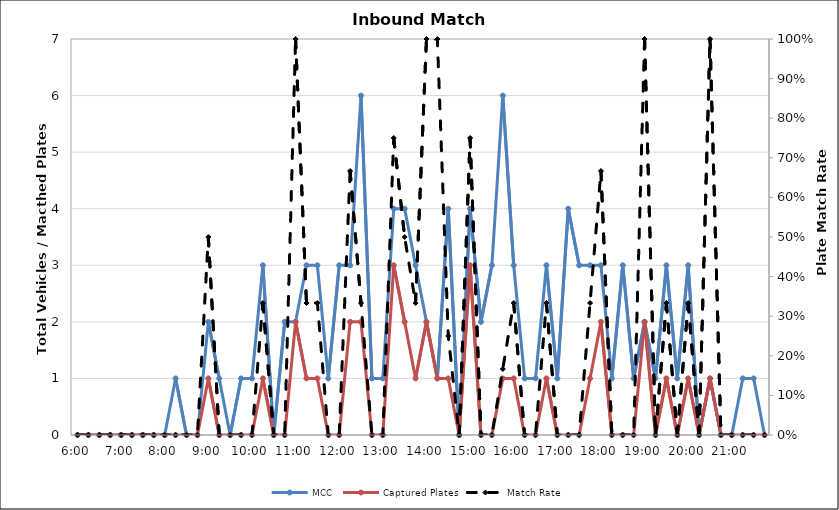
| Category | MCC | Captured Plates |
|---|---|---|
| 0.25 | 0 | 0 |
| 0.260416666666667 | 0 | 0 |
| 0.270833333333333 | 0 | 0 |
| 0.28125 | 0 | 0 |
| 0.291666666666667 | 0 | 0 |
| 0.302083333333333 | 0 | 0 |
| 0.3125 | 0 | 0 |
| 0.322916666666667 | 0 | 0 |
| 0.333333333333333 | 0 | 0 |
| 0.34375 | 1 | 0 |
| 0.354166666666667 | 0 | 0 |
| 0.364583333333333 | 0 | 0 |
| 0.375 | 2 | 1 |
| 0.385416666666667 | 1 | 0 |
| 0.395833333333333 | 0 | 0 |
| 0.40625 | 1 | 0 |
| 0.416666666666667 | 1 | 0 |
| 0.427083333333333 | 3 | 1 |
| 0.4375 | 0 | 0 |
| 0.447916666666667 | 2 | 0 |
| 0.458333333333333 | 2 | 2 |
| 0.46875 | 3 | 1 |
| 0.479166666666667 | 3 | 1 |
| 0.489583333333333 | 1 | 0 |
| 0.5 | 3 | 0 |
| 0.510416666666667 | 3 | 2 |
| 0.520833333333333 | 6 | 2 |
| 0.53125 | 1 | 0 |
| 0.541666666666667 | 1 | 0 |
| 0.552083333333333 | 4 | 3 |
| 0.5625 | 4 | 2 |
| 0.572916666666667 | 3 | 1 |
| 0.583333333333333 | 2 | 2 |
| 0.59375 | 1 | 1 |
| 0.604166666666667 | 4 | 1 |
| 0.614583333333333 | 0 | 0 |
| 0.625 | 4 | 3 |
| 0.635416666666667 | 2 | 0 |
| 0.645833333333333 | 3 | 0 |
| 0.65625 | 6 | 1 |
| 0.666666666666667 | 3 | 1 |
| 0.677083333333333 | 1 | 0 |
| 0.6875 | 1 | 0 |
| 0.697916666666667 | 3 | 1 |
| 0.708333333333333 | 1 | 0 |
| 0.71875 | 4 | 0 |
| 0.729166666666667 | 3 | 0 |
| 0.739583333333333 | 3 | 1 |
| 0.75 | 3 | 2 |
| 0.760416666666667 | 1 | 0 |
| 0.770833333333333 | 3 | 0 |
| 0.78125 | 1 | 0 |
| 0.791666666666667 | 2 | 2 |
| 0.802083333333333 | 1 | 0 |
| 0.8125 | 3 | 1 |
| 0.822916666666667 | 1 | 0 |
| 0.833333333333333 | 3 | 1 |
| 0.84375 | 0 | 0 |
| 0.854166666666667 | 1 | 1 |
| 0.864583333333333 | 0 | 0 |
| 0.875 | 0 | 0 |
| 0.885416666666667 | 1 | 0 |
| 0.895833333333333 | 1 | 0 |
| 0.90625 | 0 | 0 |